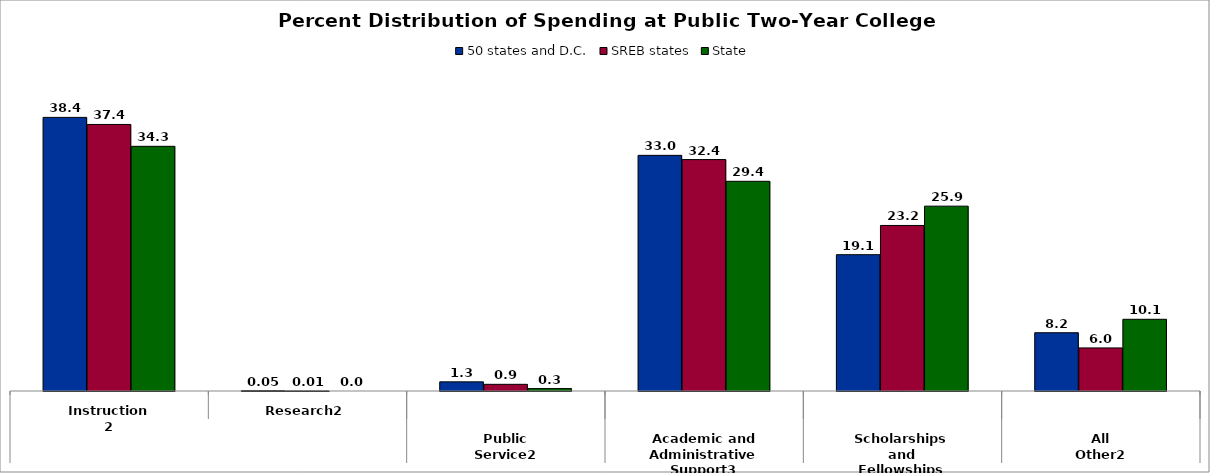
| Category | 50 states and D.C. | SREB states | State |
|---|---|---|---|
| 0 | 38.358 | 37.368 | 34.302 |
| 1 | 0.049 | 0.006 | 0 |
| 2 | 1.281 | 0.936 | 0.337 |
| 3 | 33.034 | 32.443 | 29.397 |
| 4 | 19.109 | 23.207 | 25.913 |
| 5 | 8.169 | 6.04 | 10.052 |